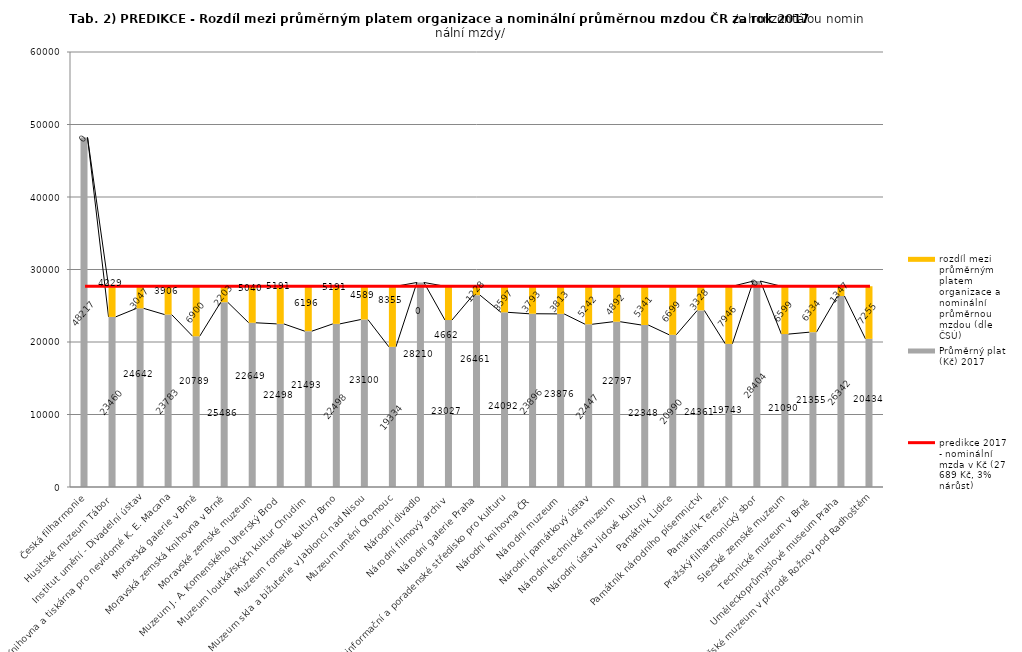
| Category | Průměrný plat (Kč) 2017 | rozdíl mezi průměrným platem organizace a nominální průměrnou mzdou (dle ČSÚ) |
|---|---|---|
| Česká filharmonie | 48217 | 0 |
| Husitské muzeum Tábor | 23460 | 4229 |
| Institut umění - Divadelní ústav | 24642 | 3047 |
| Knihovna a tiskárna pro nevidomé K. E. Macana | 23783 | 3906 |
| Moravská galerie v Brně | 20789 | 6900 |
| Moravská zemská knihovna v Brně | 25486 | 2203 |
| Moravské zemské muzeum | 22649 | 5040 |
| Muzeum J. A. Komenského Uherský Brod | 22498 | 5191 |
| Muzeum loutkářských kultur Chrudim | 21493 | 6196 |
| Muzeum romské kultury Brno | 22498 | 5191 |
| Muzeum skla a bižuterie v Jablonci nad Nisou | 23100 | 4589 |
| Muzeum umění Olomouc | 19334 | 8355 |
| Národní divadlo | 28210 | 0 |
| Národní filmový archiv | 23027 | 4662 |
| Národní galerie Praha | 26461 | 1228 |
| Národní informační a poradenské středisko pro kulturu | 24092 | 3597 |
| Národní knihovna ČR | 23896 | 3793 |
| Národní muzeum | 23876 | 3813 |
| Národní památkový ústav | 22447 | 5242 |
| Národní technické muzeum | 22797 | 4892 |
| Národní ústav lidové kultury | 22348 | 5341 |
| Památník Lidice | 20990 | 6699 |
| Památník národního písemnictví | 24361 | 3328 |
| Památník Terezín | 19743 | 7946 |
| Pražský filharmonický sbor | 28404 | 0 |
| Slezské zemské muzeum | 21090 | 6599 |
| Technické muzeum v Brně  | 21355 | 6334 |
| Uměleckoprůmyslové museum Praha | 26342 | 1347 |
| Valašské muzeum v přírodě Rožnov pod Radhoštěm | 20434 | 7255 |